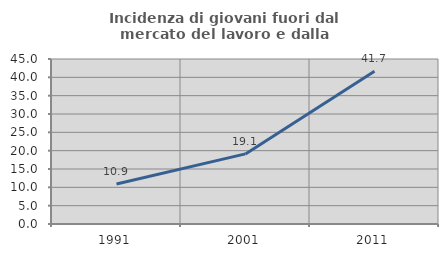
| Category | Incidenza di giovani fuori dal mercato del lavoro e dalla formazione  |
|---|---|
| 1991.0 | 10.891 |
| 2001.0 | 19.118 |
| 2011.0 | 41.667 |